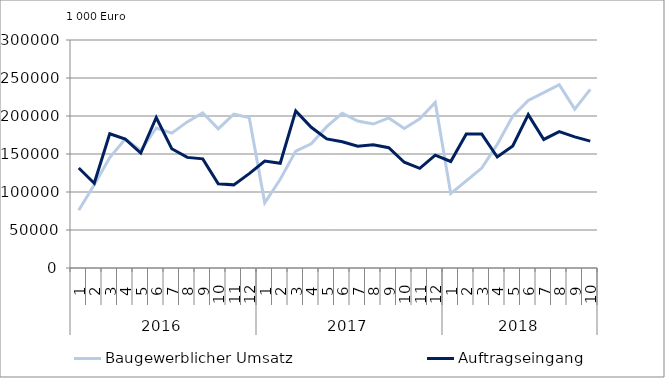
| Category | Baugewerblicher Umsatz | Auftragseingang |
|---|---|---|
| 0 | 76043.538 | 131571.482 |
| 1 | 109483.268 | 111467.248 |
| 2 | 145343.559 | 176673.268 |
| 3 | 169660.551 | 169566.96 |
| 4 | 154554.865 | 151228.165 |
| 5 | 184236.137 | 198035.655 |
| 6 | 177444.278 | 156900.898 |
| 7 | 192230.472 | 145537.167 |
| 8 | 204178.065 | 143616.217 |
| 9 | 183173.849 | 110770.94 |
| 10 | 202302.279 | 109384.188 |
| 11 | 197832.096 | 124193.91 |
| 12 | 85701.947 | 140751.008 |
| 13 | 116743.276 | 137863.383 |
| 14 | 153810.055 | 206710.579 |
| 15 | 163342.989 | 185183.797 |
| 16 | 185946.221 | 169878.51 |
| 17 | 203627.91 | 166148.392 |
| 18 | 193377.256 | 160134.206 |
| 19 | 189429.952 | 162221.206 |
| 20 | 197405.279 | 158305.285 |
| 21 | 183450.026 | 139156.761 |
| 22 | 196209.214 | 131165.419 |
| 23 | 217688.447 | 148434.901 |
| 24 | 97959.056 | 140119.385 |
| 25 | 114756.787 | 176330.213 |
| 26 | 131454.642 | 176241.061 |
| 27 | 162648.053 | 146063.407 |
| 28 | 199809.407 | 160551.931 |
| 29 | 220535.974 | 201835.846 |
| 30 | 230672.472 | 169132.23 |
| 31 | 241233.619 | 179396.293 |
| 32 | 209099.292 | 172542.764 |
| 33 | 234953.007 | 166991.729 |